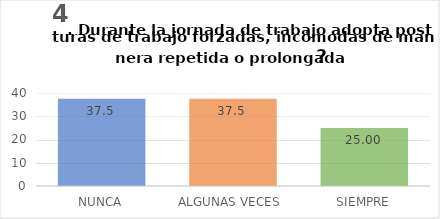
| Category | Durante la jornada de trabajo adopta posturas de trabajo forzadas, incómodas de manera repetida o prolongada? |
|---|---|
| NUNCA | 37.5 |
| ALGUNAS VECES  | 37.5 |
| SIEMPRE | 25 |